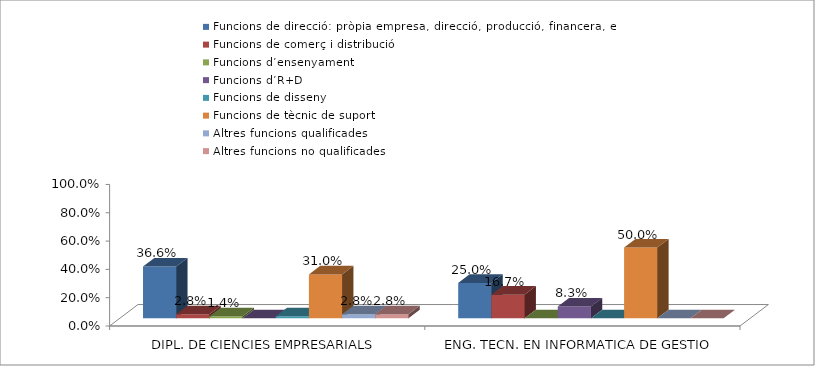
| Category | Funcions de direcció: pròpia empresa, direcció, producció, financera, etc. | Funcions de comerç i distribució | Funcions d’ensenyament | Funcions d’R+D | Funcions de disseny | Funcions de tècnic de suport | Altres funcions qualificades | Altres funcions no qualificades |
|---|---|---|---|---|---|---|---|---|
| DIPL. DE CIENCIES EMPRESARIALS | 0.366 | 0.028 | 0.014 | 0 | 0.014 | 0.31 | 0.028 | 0.028 |
| ENG. TECN. EN INFORMATICA DE GESTIO | 0.25 | 0.167 | 0 | 0.083 | 0 | 0.5 | 0 | 0 |